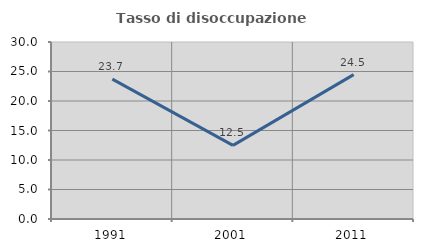
| Category | Tasso di disoccupazione giovanile  |
|---|---|
| 1991.0 | 23.718 |
| 2001.0 | 12.485 |
| 2011.0 | 24.477 |